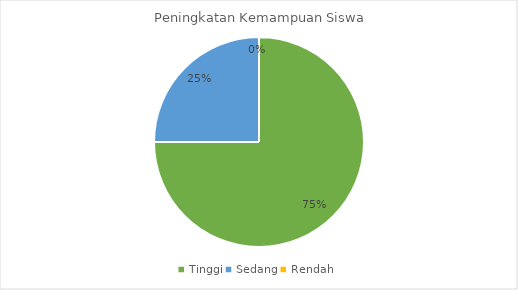
| Category | Series 0 |
|---|---|
| Tinggi | 21 |
| Sedang | 7 |
| Rendah | 0 |